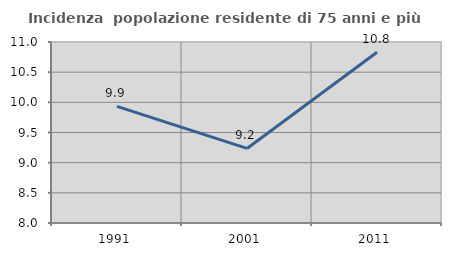
| Category | Incidenza  popolazione residente di 75 anni e più |
|---|---|
| 1991.0 | 9.934 |
| 2001.0 | 9.236 |
| 2011.0 | 10.831 |